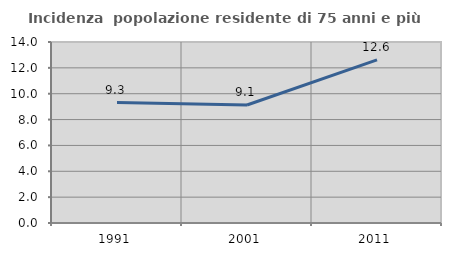
| Category | Incidenza  popolazione residente di 75 anni e più |
|---|---|
| 1991.0 | 9.319 |
| 2001.0 | 9.124 |
| 2011.0 | 12.618 |